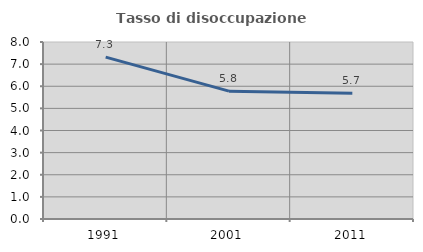
| Category | Tasso di disoccupazione giovanile  |
|---|---|
| 1991.0 | 7.317 |
| 2001.0 | 5.778 |
| 2011.0 | 5.682 |